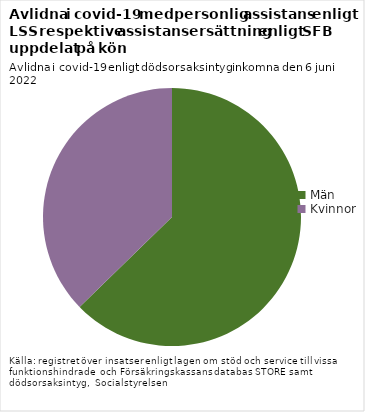
| Category | Kön |
|---|---|
| Män | 74 |
| Kvinnor | 44 |